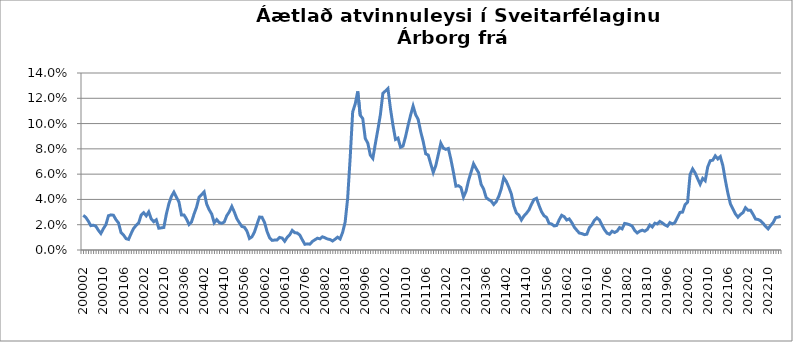
| Category | Series 0 |
|---|---|
| 200002 | 0.027 |
| 200003 | 0.026 |
| 200004 | 0.023 |
| 200005 | 0.019 |
| 200006 | 0.02 |
| 200007 | 0.019 |
| 200008 | 0.016 |
| 200009 | 0.013 |
| 200010 | 0.017 |
| 200011 | 0.02 |
| 200012 | 0.027 |
| 200101 | 0.028 |
| 200102 | 0.027 |
| 200103 | 0.024 |
| 200104 | 0.021 |
| 200105 | 0.014 |
| 200106 | 0.012 |
| 200107 | 0.009 |
| 200108 | 0.008 |
| 200109 | 0.013 |
| 200110 | 0.017 |
| 200111 | 0.02 |
| 200112 | 0.021 |
| 200201 | 0.028 |
| 200202 | 0.03 |
| 200203 | 0.027 |
| 200204 | 0.03 |
| 200205 | 0.025 |
| 200206 | 0.022 |
| 200207 | 0.024 |
| 200208 | 0.017 |
| 200209 | 0.018 |
| 200210 | 0.018 |
| 200211 | 0.028 |
| 200212 | 0.037 |
| 200301 | 0.042 |
| 200302 | 0.046 |
| 200303 | 0.042 |
| 200304 | 0.038 |
| 200305 | 0.028 |
| 200306 | 0.028 |
| 200307 | 0.025 |
| 200308 | 0.02 |
| 200309 | 0.022 |
| 200310 | 0.028 |
| 200311 | 0.034 |
| 200312 | 0.042 |
| 200401 | 0.044 |
| 200402 | 0.046 |
| 200403 | 0.036 |
| 200404 | 0.032 |
| 200405 | 0.029 |
| 200406 | 0.022 |
| 200407 | 0.024 |
| 200408 | 0.022 |
| 200409 | 0.021 |
| 200410 | 0.022 |
| 200411 | 0.027 |
| 200412 | 0.03 |
| 200501 | 0.034 |
| 200502 | 0.03 |
| 200503 | 0.025 |
| 200504 | 0.022 |
| 200505 | 0.019 |
| 200506 | 0.018 |
| 200507 | 0.015 |
| 200508 | 0.009 |
| 200509 | 0.01 |
| 200510 | 0.014 |
| 200511 | 0.02 |
| 200512 | 0.026 |
| 200601 | 0.026 |
| 200602 | 0.022 |
| 200603 | 0.015 |
| 200604 | 0.01 |
| 200605 | 0.008 |
| 200606 | 0.008 |
| 200607 | 0.008 |
| 200608 | 0.01 |
| 200609 | 0.009 |
| 200610 | 0.007 |
| 200611 | 0.01 |
| 200612 | 0.012 |
| 200701 | 0.015 |
| 200702 | 0.014 |
| 200703 | 0.013 |
| 200704 | 0.012 |
| 200705 | 0.008 |
| 200706 | 0.005 |
| 200707 | 0.005 |
| 200708 | 0.005 |
| 200709 | 0.007 |
| 200710 | 0.008 |
| 200711 | 0.009 |
| 200712 | 0.009 |
| 200801 | 0.01 |
| 200802 | 0.01 |
| 200803 | 0.009 |
| 200804 | 0.008 |
| 200805 | 0.007 |
| 200806 | 0.009 |
| 200807 | 0.01 |
| 200808 | 0.009 |
| 200809 | 0.014 |
| 200810 | 0.022 |
| 200811 | 0.041 |
| 200812 | 0.073 |
| 200901 | 0.109 |
| 200902 | 0.116 |
| 200903 | 0.125 |
| 200904 | 0.107 |
| 200905 | 0.104 |
| 200906 | 0.088 |
| 200907 | 0.085 |
| 200908 | 0.075 |
| 200909 | 0.072 |
| 200910 | 0.084 |
| 200911 | 0.095 |
| 200912 | 0.107 |
| 201001 | 0.124 |
| 201002 | 0.126 |
| 201003 | 0.128 |
| 201004 | 0.112 |
| 201005 | 0.099 |
| 201006 | 0.087 |
| 201007 | 0.089 |
| 201008 | 0.081 |
| 201009 | 0.082 |
| 201010 | 0.09 |
| 201011 | 0.099 |
| 201012 | 0.107 |
| 201101 | 0.114 |
| 201102 | 0.107 |
| 201103 | 0.103 |
| 201104 | 0.094 |
| 201105 | 0.086 |
| 201106 | 0.076 |
| 201107 | 0.075 |
| 201108 | 0.068 |
| 201109 | 0.061 |
| 201110 | 0.067 |
| 201111 | 0.076 |
| 201112 | 0.085 |
| 201201 | 0.081 |
| 201202 | 0.08 |
| 201203 | 0.08 |
| 201204 | 0.072 |
| 201205 | 0.062 |
| 201206 | 0.05 |
| 201207 | 0.051 |
| 201208 | 0.049 |
| 201209 | 0.042 |
| 201210 | 0.046 |
| 201211 | 0.055 |
| 201212 | 0.062 |
| 201301 | 0.068 |
| 201302 | 0.065 |
| 201303 | 0.061 |
| 201304 | 0.052 |
| 201305 | 0.048 |
| 201306 | 0.042 |
| 201307 | 0.04 |
| 201308 | 0.039 |
| 201309 | 0.036 |
| 201310 | 0.038 |
| 201311 | 0.042 |
| 201312 | 0.048 |
| 201401 | 0.057 |
| 201402 | 0.054 |
| 201403 | 0.05 |
| 201404 | 0.044 |
| 201405 | 0.035 |
| 201406 | 0.029 |
| 201407 | 0.028 |
| 201408 | 0.024 |
| 201409 | 0.027 |
| 201410 | 0.029 |
| 201411 | 0.032 |
| 201412 | 0.036 |
| 201501 | 0.04 |
| 201502 | 0.041 |
| 201503 | 0.035 |
| 201504 | 0.03 |
| 201505 | 0.027 |
| 201506 | 0.026 |
| 201507 | 0.021 |
| 201508 | 0.021 |
| 201509 | 0.019 |
| 201510 | 0.019 |
| 201511 | 0.024 |
| 201512 | 0.027 |
| 201601 | 0.026 |
| 201602 | 0.024 |
| 201603 | 0.025 |
| 201604 | 0.022 |
| 201605 | 0.018 |
| 201606 | 0.016 |
| 201607 | 0.013 |
| 201608 | 0.013 |
| 201609 | 0.012 |
| 201610 | 0.013 |
| 201611 | 0.018 |
| 201612 | 0.02 |
| 201701 | 0.024 |
| 201702 | 0.025 |
| 201703 | 0.024 |
| 201704 | 0.02 |
| 201705 | 0.016 |
| 201706 | 0.013 |
| 201707 | 0.012 |
| 201708 | 0.015 |
| 201709 | 0.014 |
| 201710 | 0.015 |
| 201711 | 0.018 |
| 201712 | 0.017 |
| 201801 | 0.021 |
| 201802 | 0.021 |
| 201803 | 0.02 |
| 201804 | 0.019 |
| 201805 | 0.015 |
| 201806 | 0.013 |
| 201807 | 0.015 |
| 201808 | 0.016 |
| 201809 | 0.015 |
| 201810 | 0.016 |
| 201811 | 0.02 |
| 201812 | 0.018 |
| 201901 | 0.021 |
| 201902 | 0.021 |
| 201903 | 0.023 |
| 201904 | 0.021 |
| 201905 | 0.02 |
| 201906 | 0.019 |
| 201907 | 0.022 |
| 201908 | 0.021 |
| 201909 | 0.022 |
| 201910 | 0.026 |
| 201911 | 0.03 |
| 201912 | 0.03 |
| 202001 | 0.036 |
| 202002 | 0.038 |
| 202003 | 0.06 |
| 202004 | 0.064 |
| 202005 | 0.061 |
| 202006 | 0.056 |
| 202007 | 0.052 |
| 202008 | 0.057 |
| 202009 | 0.055 |
| 202010 | 0.066 |
| 202011 | 0.071 |
| 202012 | 0.071 |
| 202101 | 0.074 |
| 202102 | 0.072 |
| 202103 | 0.074 |
| 202104 | 0.067 |
| 202105 | 0.055 |
| 202106 | 0.045 |
| 202107 | 0.037 |
| 202108 | 0.032 |
| 202109 | 0.029 |
| 202110 | 0.026 |
| 202111 | 0.028 |
| 202112 | 0.03 |
| 202201 | 0.033 |
| 202202 | 0.031 |
| 202203 | 0.031 |
| 202204 | 0.028 |
| 202205 | 0.024 |
| 202206 | 0.024 |
| 202207 | 0.023 |
| 202208 | 0.021 |
| 202209 | 0.019 |
| 202210 | 0.017 |
| 202211 | 0.019 |
| 202212 | 0.022 |
| 202301 | 0.026 |
| 202302 | 0.026 |
| 202303 | 0.027 |